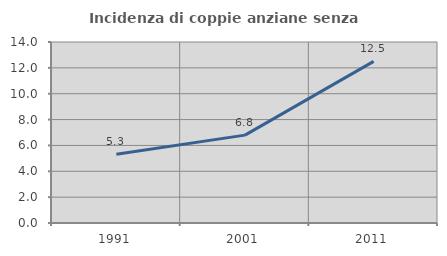
| Category | Incidenza di coppie anziane senza figli  |
|---|---|
| 1991.0 | 5.31 |
| 2001.0 | 6.796 |
| 2011.0 | 12.5 |